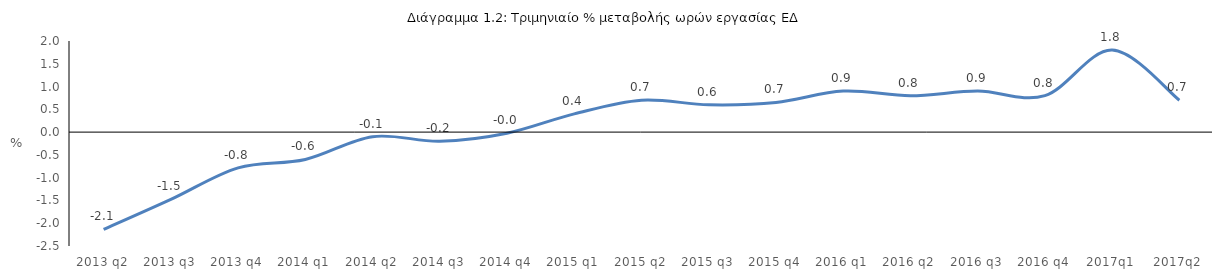
| Category | Series 0 |
|---|---|
| 2013 q2 | -2.137 |
| 2013 q3 | -1.478 |
| 2013 q4 | -0.785 |
| 2014 q1 | -0.6 |
| 2014 q2 | -0.1 |
| 2014 q3 | -0.2 |
| 2014 q4 | -0.023 |
| 2015 q1 | 0.4 |
| 2015 q2 | 0.7 |
| 2015 q3 | 0.6 |
| 2015 q4 | 0.65 |
| 2016 q1 | 0.9 |
| 2016 q2 | 0.8 |
| 2016 q3 | 0.9 |
| 2016 q4 | 0.8 |
| 2017q1 | 1.8 |
| 2017q2 | 0.7 |